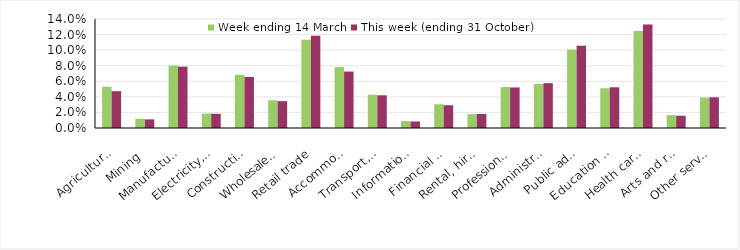
| Category | Week ending 14 March | This week (ending 31 October) |
|---|---|---|
| Agriculture, forestry and fishing | 0.053 | 0.047 |
| Mining | 0.012 | 0.011 |
| Manufacturing | 0.08 | 0.079 |
| Electricity, gas, water and waste services | 0.018 | 0.018 |
| Construction | 0.068 | 0.066 |
| Wholesale trade | 0.036 | 0.034 |
| Retail trade | 0.113 | 0.118 |
| Accommodation and food services | 0.078 | 0.072 |
| Transport, postal and warehousing | 0.043 | 0.042 |
| Information media and telecommunications | 0.009 | 0.008 |
| Financial and insurance services | 0.03 | 0.029 |
| Rental, hiring and real estate services | 0.018 | 0.018 |
| Professional, scientific and technical services | 0.052 | 0.052 |
| Administrative and support services | 0.056 | 0.058 |
| Public administration and safety | 0.101 | 0.106 |
| Education and training | 0.051 | 0.052 |
| Health care and social assistance | 0.124 | 0.133 |
| Arts and recreation services | 0.016 | 0.016 |
| Other services | 0.039 | 0.039 |